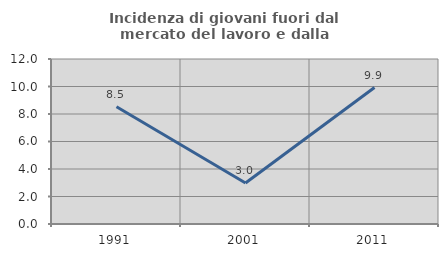
| Category | Incidenza di giovani fuori dal mercato del lavoro e dalla formazione  |
|---|---|
| 1991.0 | 8.524 |
| 2001.0 | 2.98 |
| 2011.0 | 9.926 |